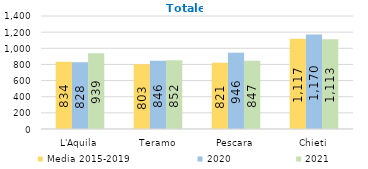
| Category | Media 2015-2019  | 2020 | 2021 |
|---|---|---|---|
| L'Aquila | 833.6 | 828 | 939 |
| Teramo | 802.8 | 846 | 852 |
| Pescara | 820.8 | 946 | 847 |
| Chieti | 1116.6 | 1170 | 1113 |